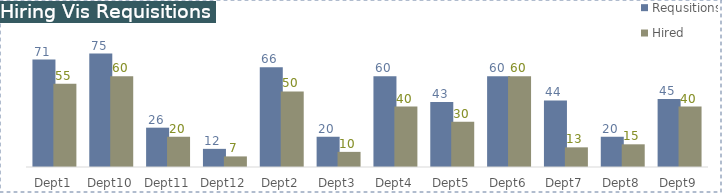
| Category | Requsitions | Hired |
|---|---|---|
| Dept1 | 71 | 55 |
| Dept10 | 75 | 60 |
| Dept11 | 26 | 20 |
| Dept12 | 12 | 7 |
| Dept2 | 66 | 50 |
| Dept3 | 20 | 10 |
| Dept4 | 60 | 40 |
| Dept5 | 43 | 30 |
| Dept6 | 60 | 60 |
| Dept7 | 44 | 13 |
| Dept8 | 20 | 15 |
| Dept9 | 45 | 40 |